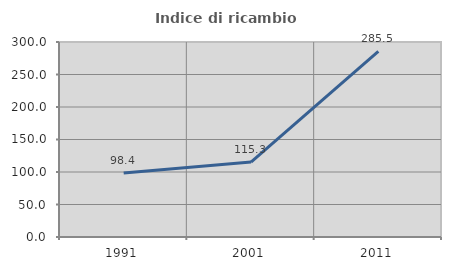
| Category | Indice di ricambio occupazionale  |
|---|---|
| 1991.0 | 98.378 |
| 2001.0 | 115.271 |
| 2011.0 | 285.455 |